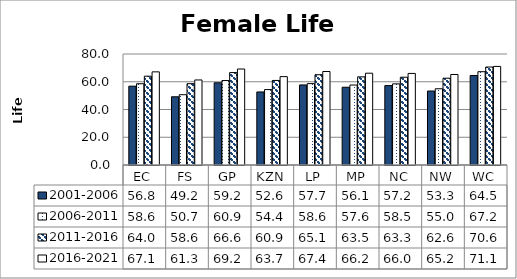
| Category | 2001-2006 | 2006-2011 | 2011-2016 | 2016-2021 |
|---|---|---|---|---|
| EC | 56.808 | 58.572 | 64.002 | 67.135 |
| FS | 49.176 | 50.658 | 58.607 | 61.285 |
| GP | 59.238 | 60.872 | 66.604 | 69.181 |
| KZN | 52.646 | 54.367 | 60.94 | 63.69 |
| LP | 57.692 | 58.639 | 65.077 | 67.386 |
| MP | 56.057 | 57.638 | 63.52 | 66.158 |
| NC | 57.244 | 58.472 | 63.256 | 65.997 |
| NW | 53.317 | 54.95 | 62.552 | 65.242 |
| WC | 64.511 | 67.246 | 70.611 | 71.058 |